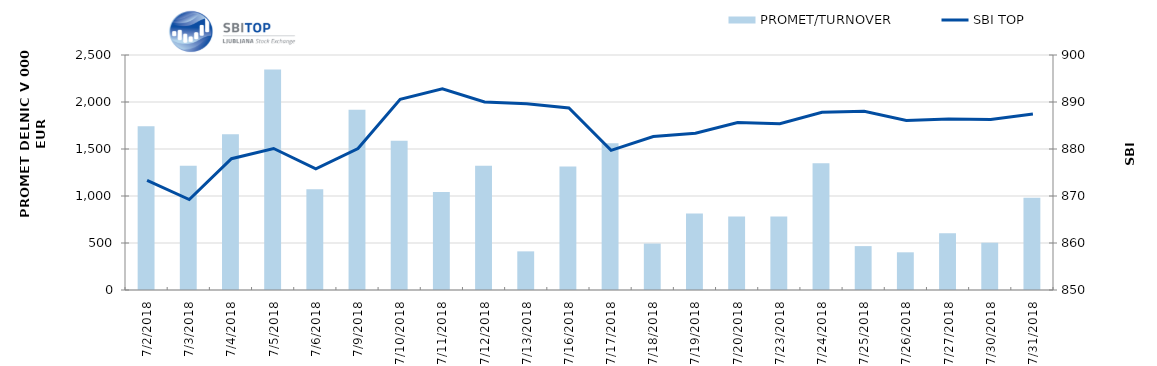
| Category | PROMET/TURNOVER |
|---|---|
| 7/2/18 | 1743 |
| 7/3/18 | 1322 |
| 7/4/18 | 1656 |
| 7/5/18 | 2346 |
| 7/6/18 | 1073 |
| 7/9/18 | 1917 |
| 7/10/18 | 1589 |
| 7/11/18 | 1042 |
| 7/12/18 | 1323 |
| 7/13/18 | 411 |
| 7/16/18 | 1314 |
| 7/17/18 | 1560 |
| 7/18/18 | 494 |
| 7/19/18 | 813 |
| 7/20/18 | 782 |
| 7/23/18 | 783 |
| 7/24/18 | 1348 |
| 7/25/18 | 467 |
| 7/26/18 | 401 |
| 7/27/18 | 604 |
| 7/30/18 | 503 |
| 7/31/18 | 981 |